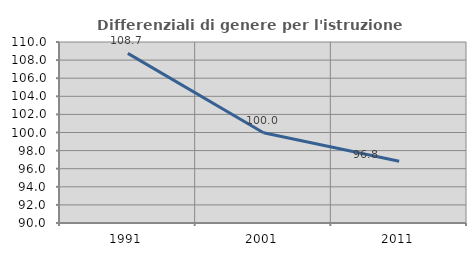
| Category | Differenziali di genere per l'istruzione superiore |
|---|---|
| 1991.0 | 108.744 |
| 2001.0 | 99.966 |
| 2011.0 | 96.821 |